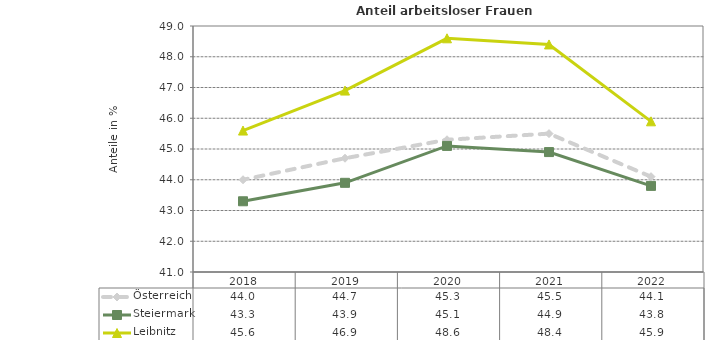
| Category | Österreich | Steiermark | Leibnitz |
|---|---|---|---|
| 2022.0 | 44.1 | 43.8 | 45.9 |
| 2021.0 | 45.5 | 44.9 | 48.4 |
| 2020.0 | 45.3 | 45.1 | 48.6 |
| 2019.0 | 44.7 | 43.9 | 46.9 |
| 2018.0 | 44 | 43.3 | 45.6 |